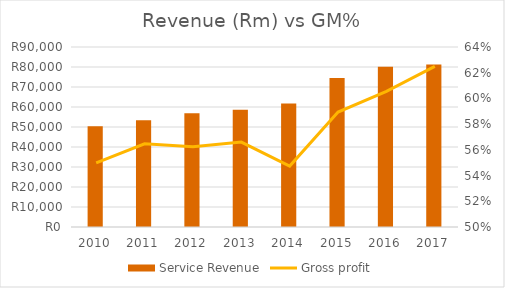
| Category | Service Revenue |
|---|---|
| 2010.0 | 50431 |
| 2011.0 | 53371 |
| 2012.0 | 56932 |
| 2013.0 | 58607 |
| 2014.0 | 61806 |
| 2015.0 | 74500 |
| 2016.0 | 80077 |
| 2017.0 | 81278 |